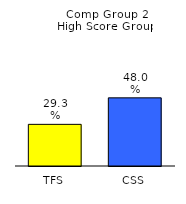
| Category | Series 0 |
|---|---|
| TFS | 0.293 |
| CSS | 0.48 |